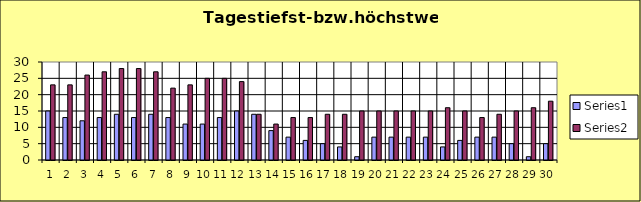
| Category | Series 0 | Series 1 |
|---|---|---|
| 0 | 15 | 23 |
| 1 | 13 | 23 |
| 2 | 12 | 26 |
| 3 | 13 | 27 |
| 4 | 14 | 28 |
| 5 | 13 | 28 |
| 6 | 14 | 27 |
| 7 | 13 | 22 |
| 8 | 11 | 23 |
| 9 | 11 | 25 |
| 10 | 13 | 25 |
| 11 | 15 | 24 |
| 12 | 14 | 14 |
| 13 | 9 | 11 |
| 14 | 7 | 13 |
| 15 | 6 | 13 |
| 16 | 5 | 14 |
| 17 | 4 | 14 |
| 18 | 1 | 15 |
| 19 | 7 | 15 |
| 20 | 7 | 15 |
| 21 | 7 | 15 |
| 22 | 7 | 15 |
| 23 | 4 | 16 |
| 24 | 6 | 15 |
| 25 | 7 | 13 |
| 26 | 7 | 14 |
| 27 | 5 | 15 |
| 28 | 1 | 16 |
| 29 | 5 | 18 |